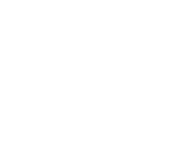
| Category | Series 0 |
|---|---|
| Inquiring mind | 0 |
| Intellectual insight | 0 |
| Innovation | 0 |
| Argument construction | 0 |
| Intellectual risk | 0 |